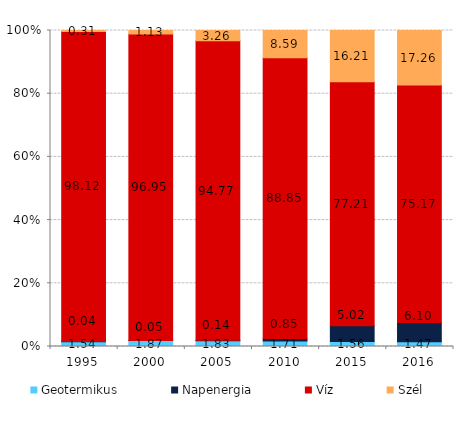
| Category | Geotermikus | Napenergia | Víz | Szél |
|---|---|---|---|---|
| 1995.0 | 1.536 | 0.039 | 98.118 | 0.306 |
| 2000.0 | 1.867 | 0.054 | 96.954 | 1.126 |
| 2005.0 | 1.829 | 0.141 | 94.768 | 3.262 |
| 2010.0 | 1.713 | 0.851 | 88.85 | 8.586 |
| 2015.0 | 1.556 | 5.023 | 77.209 | 16.212 |
| 2016.0 | 1.472 | 6.1 | 75.169 | 17.259 |